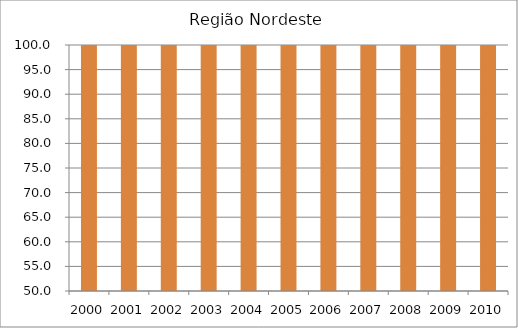
| Category | Região Nordeste |
|---|---|
| 2000.0 | 114.3 |
| 2001.0 | 117.6 |
| 2002.0 | 113.8 |
| 2003.0 | 111.7 |
| 2004.0 | 108.5 |
| 2005.0 | 107.6 |
| 2006.0 | 115.7 |
| 2007.0 | 117.5 |
| 2008.0 | 110.9 |
| 2009.0 | 108.6 |
| 2010.0 | 107.56 |